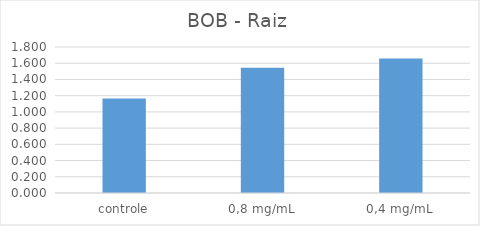
| Category | Series 0 |
|---|---|
| controle | 1.164 |
| 0,8 mg/mL | 1.544 |
| 0,4 mg/mL | 1.657 |